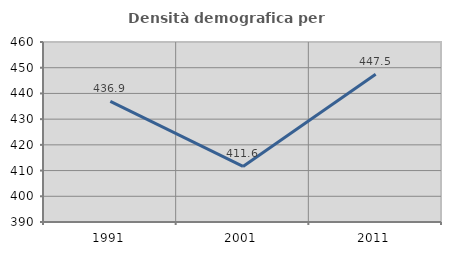
| Category | Densità demografica |
|---|---|
| 1991.0 | 436.911 |
| 2001.0 | 411.623 |
| 2011.0 | 447.466 |